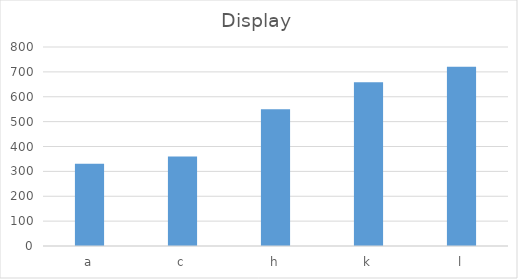
| Category | Display |
|---|---|
| a | 330.33 |
| c | 359.85 |
| h | 549.9 |
| k | 658.24 |
| l | 720.2 |